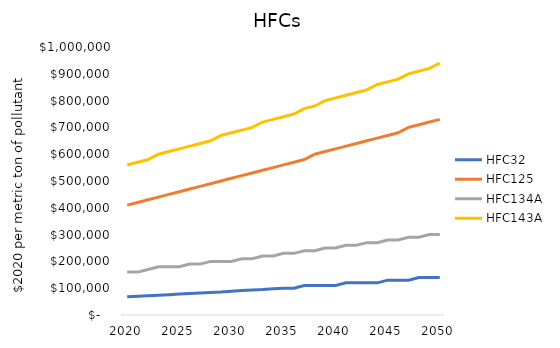
| Category | HFC32 | HFC125 | HFC134A | HFC143A |
|---|---|---|---|---|
| 2020.0 | 68000 | 410000 | 160000 | 560000 |
| 2021.0 | 70000 | 420000 | 160000 | 570000 |
| 2022.0 | 72000 | 430000 | 170000 | 580000 |
| 2023.0 | 74000 | 440000 | 180000 | 600000 |
| 2024.0 | 76000 | 450000 | 180000 | 610000 |
| 2025.0 | 78000 | 460000 | 180000 | 620000 |
| 2026.0 | 80000 | 470000 | 190000 | 630000 |
| 2027.0 | 82000 | 480000 | 190000 | 640000 |
| 2028.0 | 84000 | 490000 | 200000 | 650000 |
| 2029.0 | 86000 | 500000 | 200000 | 670000 |
| 2030.0 | 89000 | 510000 | 200000 | 680000 |
| 2031.0 | 91000 | 520000 | 210000 | 690000 |
| 2032.0 | 93000 | 530000 | 210000 | 700000 |
| 2033.0 | 95000 | 540000 | 220000 | 720000 |
| 2034.0 | 98000 | 550000 | 220000 | 730000 |
| 2035.0 | 100000 | 560000 | 230000 | 740000 |
| 2036.0 | 100000 | 570000 | 230000 | 750000 |
| 2037.0 | 110000 | 580000 | 240000 | 770000 |
| 2038.0 | 110000 | 600000 | 240000 | 780000 |
| 2039.0 | 110000 | 610000 | 250000 | 800000 |
| 2040.0 | 110000 | 620000 | 250000 | 810000 |
| 2041.0 | 120000 | 630000 | 260000 | 820000 |
| 2042.0 | 120000 | 640000 | 260000 | 830000 |
| 2043.0 | 120000 | 650000 | 270000 | 840000 |
| 2044.0 | 120000 | 660000 | 270000 | 860000 |
| 2045.0 | 130000 | 670000 | 280000 | 870000 |
| 2046.0 | 130000 | 680000 | 280000 | 880000 |
| 2047.0 | 130000 | 700000 | 290000 | 900000 |
| 2048.0 | 140000 | 710000 | 290000 | 910000 |
| 2049.0 | 140000 | 720000 | 300000 | 920000 |
| 2050.0 | 140000 | 730000 | 300000 | 940000 |